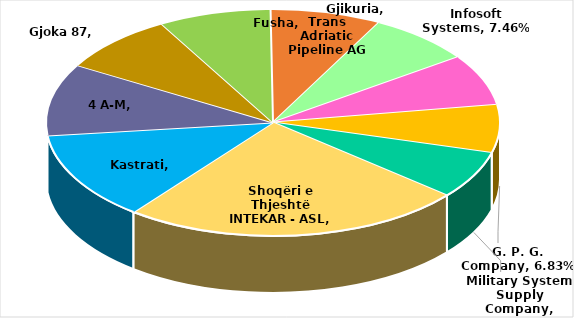
| Category | Pesha ndaj totalit (në %) |
|---|---|
| Shoqëri e Thjeshtë INTEKAR - ASL | 0.244 |
| Kastrati | 0.126 |
| 4 A-M | 0.103 |
| Gjoka 87 | 0.084 |
| Fusha | 0.08 |
| Gjikuria | 0.079 |
| Infosoft Systems | 0.075 |
| Trans Adriatic Pipeline AG Albania | 0.073 |
| G. P. G. Company | 0.068 |
| Military System Supply Company | 0.068 |